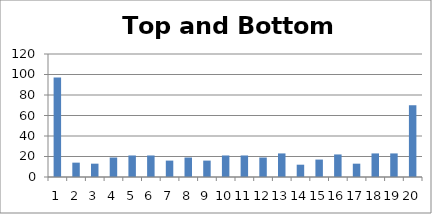
| Category | Top and Bottom Slice |
|---|---|
| 0 | 97 |
| 1 | 14 |
| 2 | 13 |
| 3 | 19 |
| 4 | 21 |
| 5 | 21 |
| 6 | 16 |
| 7 | 19 |
| 8 | 16 |
| 9 | 21 |
| 10 | 21 |
| 11 | 19 |
| 12 | 23 |
| 13 | 12 |
| 14 | 17 |
| 15 | 22 |
| 16 | 13 |
| 17 | 23 |
| 18 | 23 |
| 19 | 70 |